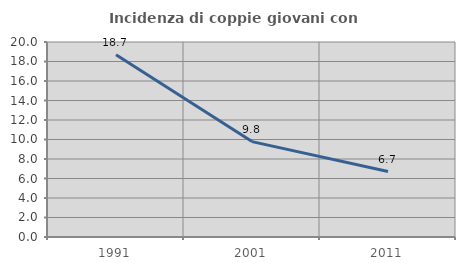
| Category | Incidenza di coppie giovani con figli |
|---|---|
| 1991.0 | 18.693 |
| 2001.0 | 9.784 |
| 2011.0 | 6.71 |